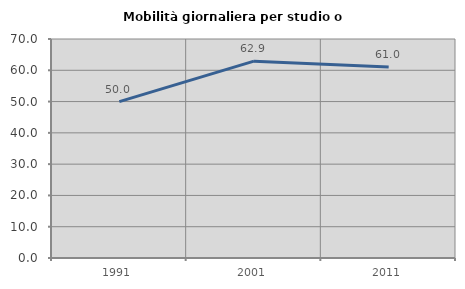
| Category | Mobilità giornaliera per studio o lavoro |
|---|---|
| 1991.0 | 50 |
| 2001.0 | 62.921 |
| 2011.0 | 61.029 |